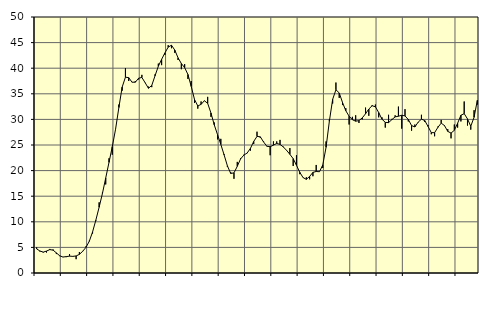
| Category | Piggar | Series 1 |
|---|---|---|
| nan | 5 | 4.7 |
| 87.0 | 4.2 | 4.3 |
| 87.0 | 4 | 4.08 |
| 87.0 | 4 | 4.28 |
| nan | 4.7 | 4.57 |
| 88.0 | 4.6 | 4.46 |
| 88.0 | 3.7 | 3.93 |
| 88.0 | 3.3 | 3.37 |
| nan | 3.1 | 3.12 |
| 89.0 | 3.1 | 3.2 |
| 89.0 | 3.7 | 3.29 |
| 89.0 | 3.2 | 3.25 |
| nan | 2.7 | 3.33 |
| 90.0 | 4.1 | 3.64 |
| 90.0 | 4.3 | 4.24 |
| 90.0 | 5.2 | 5.01 |
| nan | 6.3 | 6.19 |
| 91.0 | 7.7 | 8.01 |
| 91.0 | 10.2 | 10.33 |
| 91.0 | 13.8 | 12.85 |
| nan | 15.7 | 15.53 |
| 92.0 | 17.3 | 18.55 |
| 92.0 | 22.4 | 21.61 |
| 92.0 | 23.1 | 24.68 |
| nan | 28.1 | 28.09 |
| 93.0 | 32.9 | 32.32 |
| 93.0 | 35.6 | 36.3 |
| 93.0 | 40 | 38.25 |
| nan | 37.5 | 38.15 |
| 94.0 | 37.3 | 37.27 |
| 94.0 | 37.5 | 37.26 |
| 94.0 | 37.8 | 38.04 |
| nan | 38.7 | 38.19 |
| 95.0 | 37.1 | 37.15 |
| 95.0 | 36.4 | 36.08 |
| 95.0 | 36.3 | 36.63 |
| nan | 38.8 | 38.52 |
| 96.0 | 40.9 | 40.38 |
| 96.0 | 40.6 | 41.73 |
| 96.0 | 42.6 | 42.98 |
| nan | 44.5 | 44.12 |
| 97.0 | 43.9 | 44.49 |
| 97.0 | 43 | 43.54 |
| 97.0 | 41.6 | 42.02 |
| nan | 39.8 | 40.91 |
| 98.0 | 40.8 | 40.12 |
| 98.0 | 37.9 | 38.77 |
| 98.0 | 37.5 | 36.44 |
| nan | 33.2 | 33.9 |
| 99.0 | 32.1 | 32.62 |
| 99.0 | 33.5 | 32.94 |
| 99.0 | 33.7 | 33.64 |
| nan | 34.4 | 33.14 |
| 0.0 | 30.5 | 31.25 |
| 0.0 | 29.4 | 28.95 |
| 0.0 | 26.1 | 27.02 |
| nan | 26.2 | 25.12 |
| 1.0 | 23.2 | 23.06 |
| 1.0 | 20.7 | 20.93 |
| 1.0 | 19.7 | 19.45 |
| nan | 18.4 | 19.55 |
| 2.0 | 21.7 | 20.84 |
| 2.0 | 22.4 | 22.27 |
| 2.0 | 23.1 | 23.03 |
| nan | 23.4 | 23.43 |
| 3.0 | 23.9 | 24.34 |
| 3.0 | 25.2 | 25.69 |
| 3.0 | 27.6 | 26.68 |
| nan | 26.4 | 26.6 |
| 4.0 | 25.7 | 25.59 |
| 4.0 | 24.7 | 24.76 |
| 4.0 | 23 | 24.67 |
| nan | 25.7 | 24.97 |
| 5.0 | 25.7 | 25.3 |
| 5.0 | 26 | 25.12 |
| 5.0 | 24.7 | 24.62 |
| nan | 24 | 23.95 |
| 6.0 | 24.4 | 23.18 |
| 6.0 | 20.9 | 22.33 |
| 6.0 | 23 | 21.04 |
| nan | 19.3 | 19.68 |
| 7.0 | 18.6 | 18.64 |
| 7.0 | 18.7 | 18.29 |
| 7.0 | 18.3 | 18.86 |
| nan | 18.9 | 19.65 |
| 8.0 | 21.1 | 19.83 |
| 8.0 | 19.8 | 19.78 |
| 8.0 | 20.5 | 21.11 |
| nan | 25.7 | 24.56 |
| 9.0 | 30 | 29.63 |
| 9.0 | 33.1 | 33.91 |
| 9.0 | 37.2 | 35.79 |
| nan | 34.2 | 35.17 |
| 10.0 | 32.8 | 33.31 |
| 10.0 | 32.2 | 31.69 |
| 10.0 | 29 | 30.63 |
| nan | 30.5 | 29.94 |
| 11.0 | 30.8 | 29.65 |
| 11.0 | 29.3 | 29.76 |
| 11.0 | 30 | 30.29 |
| nan | 32.3 | 31.1 |
| 12.0 | 30.7 | 32.03 |
| 12.0 | 32.8 | 32.67 |
| 12.0 | 32.9 | 32.46 |
| nan | 30.4 | 31.34 |
| 13.0 | 30.4 | 30.04 |
| 13.0 | 28.4 | 29.42 |
| 13.0 | 30.9 | 29.37 |
| nan | 30.1 | 29.95 |
| 14.0 | 30.8 | 30.49 |
| 14.0 | 32.5 | 30.62 |
| 14.0 | 28.2 | 30.81 |
| nan | 32 | 30.68 |
| 15.0 | 29.6 | 29.98 |
| 15.0 | 27.8 | 28.8 |
| 15.0 | 29 | 28.52 |
| nan | 29.4 | 29.46 |
| 16.0 | 30.9 | 30.05 |
| 16.0 | 29.5 | 29.78 |
| 16.0 | 28.9 | 28.63 |
| nan | 27.1 | 27.41 |
| 17.0 | 26.7 | 27.41 |
| 17.0 | 28.6 | 28.44 |
| 17.0 | 29.9 | 29.27 |
| nan | 28.7 | 28.8 |
| 18.0 | 28.1 | 27.66 |
| 18.0 | 26.3 | 27.33 |
| 18.0 | 29 | 27.87 |
| nan | 28.4 | 29.25 |
| 19.0 | 29.6 | 30.81 |
| 19.0 | 33.5 | 31.12 |
| 19.0 | 28.8 | 30.1 |
| nan | 28 | 28.66 |
| 20.0 | 31.8 | 30.42 |
| 20.0 | 32.9 | 33.73 |